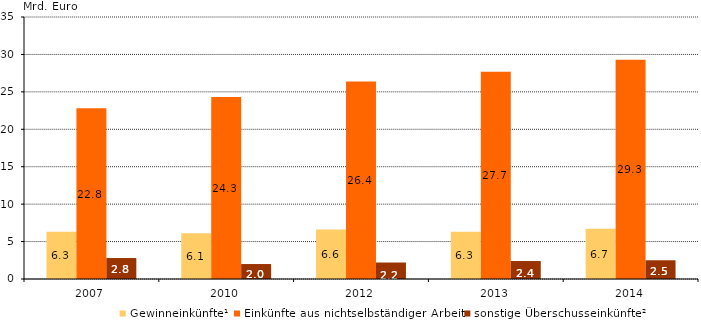
| Category | Gewinneinkünfte¹ | Einkünfte aus nichtselbständiger Arbeit | sonstige Überschusseinkünfte² |
|---|---|---|---|
| 2007.0 | 6.3 | 22.8 | 2.8 |
| 2010.0 | 6.1 | 24.3 | 2 |
| 2012.0 | 6.6 | 26.4 | 2.2 |
| 2013.0 | 6.3 | 27.7 | 2.4 |
| 2014.0 | 6.7 | 29.3 | 2.5 |